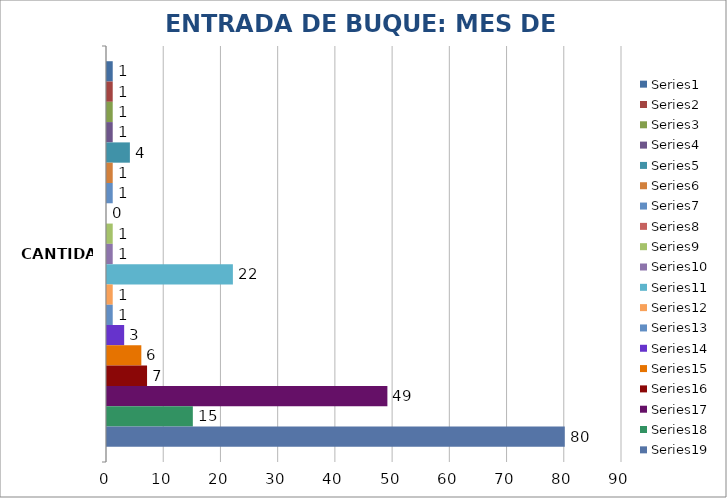
| Category | Series 0 | Series 1 | Series 2 | Series 3 | Series 4 | Series 5 | Series 6 | Series 7 | Series 8 | Series 9 | Series 10 | Series 11 | Series 12 | Series 13 | Series 14 | Series 15 | Series 16 | Series 17 | Series 18 |
|---|---|---|---|---|---|---|---|---|---|---|---|---|---|---|---|---|---|---|---|
| CANTIDAD | 1 | 1 | 1 | 1 | 4 | 1 | 1 | 0 | 1 | 1 | 22 | 1 | 1 | 3 | 6 | 7 | 49 | 15 | 80 |